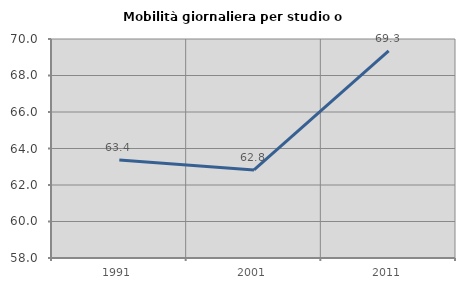
| Category | Mobilità giornaliera per studio o lavoro |
|---|---|
| 1991.0 | 63.37 |
| 2001.0 | 62.825 |
| 2011.0 | 69.343 |